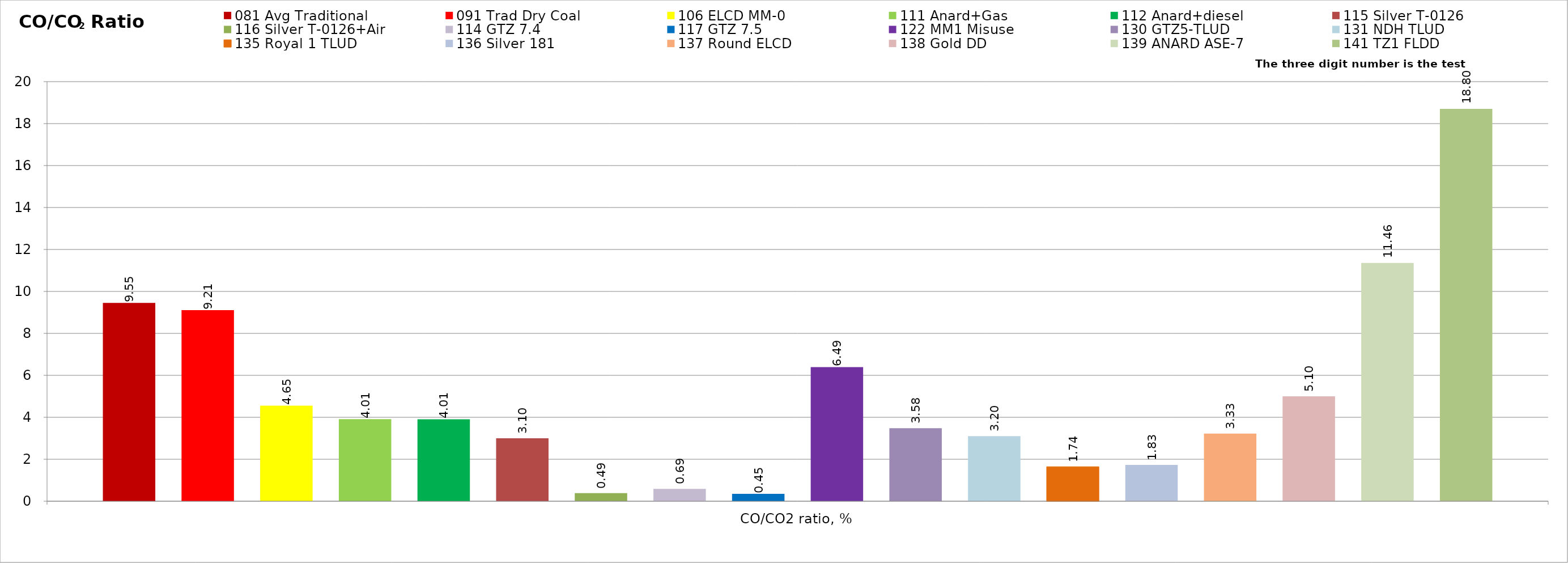
| Category | 081 Avg Traditional | 091 Trad Dry Coal | 106 ELCD MM-0 | 111 Anard+Gas | 112 Anard+diesel | 115 Silver T-0126 | 116 Silver T-0126+Air | 114 GTZ 7.4 | 117 GTZ 7.5 | 122 MM1 Misuse | 130 GTZ5-TLUD | 131 NDH TLUD | 135 Royal 1 TLUD | 136 Silver 181 | 137 Round ELCD | 138 Gold DD | 139 ANARD ASE-7 | 141 TZ1 FLDD |
|---|---|---|---|---|---|---|---|---|---|---|---|---|---|---|---|---|---|---|
| CO/CO2 ratio, % | 9.554 | 9.207 | 4.655 | 4.015 | 4.006 | 3.102 | 0.486 | 0.688 | 0.454 | 6.493 | 3.577 | 3.201 | 1.744 | 1.831 | 3.325 | 5.098 | 11.456 | 18.8 |